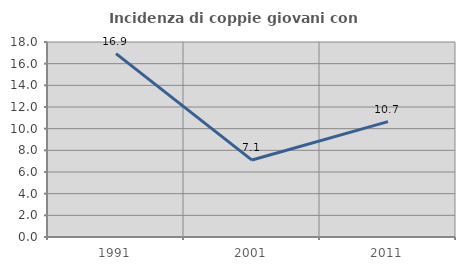
| Category | Incidenza di coppie giovani con figli |
|---|---|
| 1991.0 | 16.933 |
| 2001.0 | 7.102 |
| 2011.0 | 10.653 |